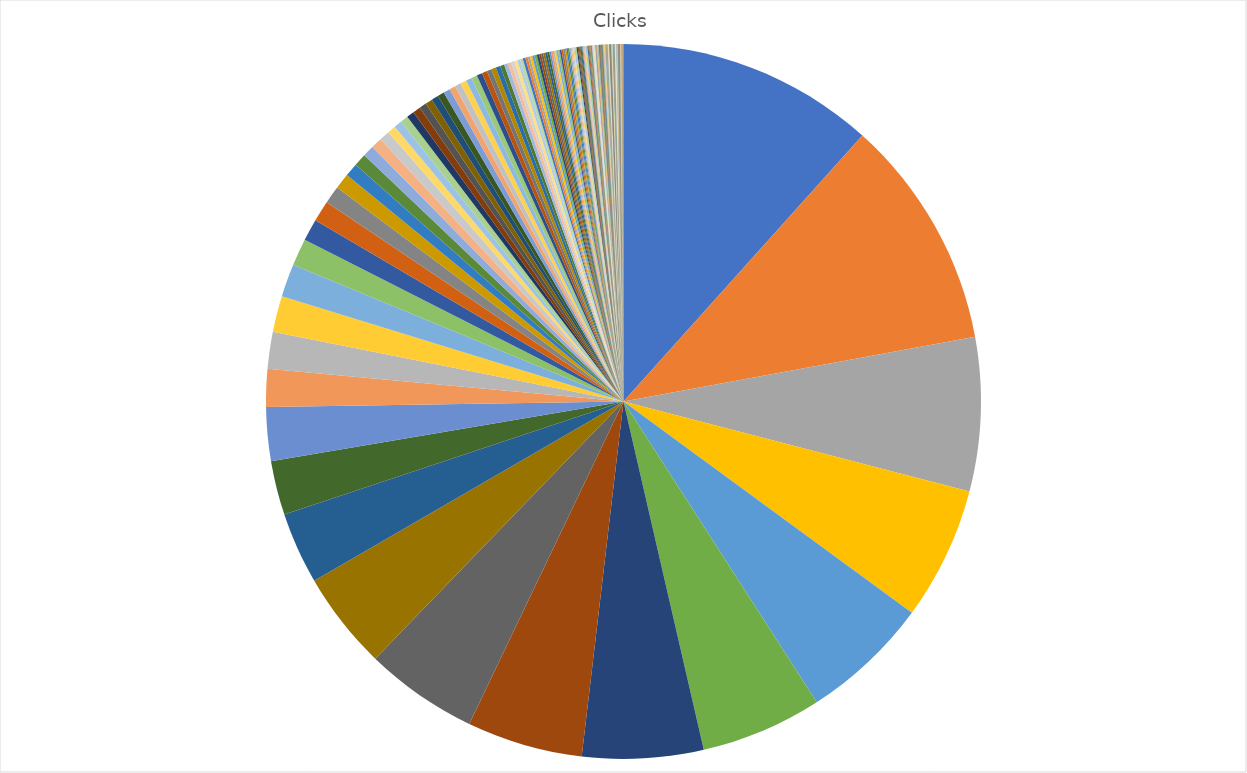
| Category | Clicks |
|---|---|
| https://www.creativescotland.com/funding/funding-programmes/hardship-fund-for-creative-freelancers | 883 |
| https://www.gov.scot/news/extending-support-for-hospitality-retail-and-leisure/ | 793 |
| https://www.gov.scot/news/accelerating-support-1/ | 527 |
| https://www.gov.scot/publications/coronavirus-covid-19-strategic-framework-business-fund/pages/overview/ | 456 |
| https://www.gov.uk/guidance/claim-a-grant-through-the-self-employment-income-support-scheme | 443 |
| https://www.digitalboostdevelopmentgrant.co.uk/ | 416 |
| https://www.visitscotland.org/events/funding/pivotal-event-businesses-fund | 415 |
| https://www.gov.uk/government/news/chancellor-extends-furlough-and-loan-schemes | 397 |
| https://www.gov.scot/publications/coronavirus-covid-19-stay-at-home-guidance/ | 388 |
| https://www.british-business-bank.co.uk/ourpartners/coronavirus-business-interruption-loan-scheme-cbils-2/ | 335 |
| https://www.gov.scot/publications/coronavirus-covid-19-manufacturing-sector-guidance/pages/where-we-are-now/ | 246 |
| https://www.gov.uk/guidance/claim-for-wages-through-the-coronavirus-job-retention-scheme | 186 |
| https://www.gov.scot/publications/coronavirus-covid-19-strategic-framework-business-fund/pages/eligibility/ | 184 |
| https://www.gov.scot/publications/coronavirus-covid-19-taxi-and-private-hire-driver-support-fund/ | 129 |
| https://www.parentclub.scot/articles/your-guide-childcare | 126 |
| https://r1.dotdigital-pages.com/p/4X7B-3CA/fbs-email-updates | 124 |
| https://www.gov.uk/guidance/apply-for-a-coronavirus-bounce-back-loan | 113 |
| https://www.gov.scot/news/strengthening-lockdown-restrictions/ | 93 |
| https://www.gov.scot/publications/coronavirus-covid-19-guidance-on-travel-and-transport/#travelbetween | 75 |
| http://www.renfrewshire.gov.uk/coronavirus-businesses#Renfrewshire-Business-Support-Fund | 72 |
| https://www.gov.scot/publications/coronavirus-covid-19-public-health-checks-at-borders/pages/exemptions/ | 61 |
| https://www.gov.uk/government/organisations/insolvency-service | 53 |
| https://www.cs-ic.org/constructionscotland/resources/ | 46 |
| https://www.gov.uk/government/news/business-evictions-ban-extended-until-march | 43 |
| https://www.gov.uk/government/publications/job-retention-bonus/job-retention-bonus | 39 |
| https://www.glasgow.gov.uk/article/25866/Information-for-Service-Users | 38 |
| https://www.gov.scot/publications/coronavirus-covid-19-small-and-micro-businesses-guidance/ | 36 |
| https://www.creativescotland.com/__data/assets/pdf_file/0011/85295/Hardship_Fund_For_Creative_Freelancers_Guidance.pdf | 28 |
| https://www.highland.gov.uk/info/20016/coronavirus/945/strategic_framework_business_fund | 27 |
| https://www.gov.scot/news/supporting-the-legal-profession/ | 27 |
| https://www.gov.scot/publications/coronavirus-covid-19-retail-sector-guidance/pages/close-contact-services/ | 26 |
| https://www.creativescotland.com/funding/funding-programmes/targeted-funding/touring-fund | 26 |
| https://www.gov.scot/publications/coronavirus-covid-19-protection-levels/ | 25 |
| https://www.edinburgh.gov.uk/coronavirus-4/businesses-employers/4?documentId=12924&categoryId=20297 | 24 |
| https://scvo.scot/support/coronavirus/funding/scottish-government/community-recovery | 24 |
| https://www.gov.scot/publications/coronavirus-covid-19-tourism-and-hospitality-sector-guidance/ | 23 |
| https://www.gov.scot/publications/coronavirus-covid-19-public-health-checks-at-borders/pages/overview/ | 23 |
| https://www.gov.uk/guidance/coronavirus-covid-19-what-to-do-if-youre-self-employed-and-getting-less-work-or-no-work | 21 |
| https://www.foodstandards.gov.scot/publications-and-research/publications/covid-19-guidance-for-food-business-operators-and-their-employees | 21 |
| https://www.bgateway.com/resources/running-a-business | 21 |
| https://www.businessgatewayfife.com/level3-business-support | 20 |
| https://www.northlanarkshire.gov.uk/coronavirus/support-businesses/strategic-framework-business-grant | 20 |
| https://findbusinesssupport.gov.scot/media/1099/covid-19-business-continuity-checklist-110620.docx | 19 |
| https://www.gov.uk/guidance/pay-coronavirus-job-retention-scheme-grants-back | 18 |
| https://www.gov.scot/publications/coronavirus-covid-19-returning-to-work/ | 16 |
| https://www.gov.scot/news/travel-corridors-suspended/ | 16 |
| https://www.gov.scot/publications/coronavirus-covid-19-retail-sector-guidance/ | 16 |
| https://www.gov.uk/guidance/haulier-advice-site-locations | 14 |
| https://www.southlanarkshire.gov.uk/SFbusinessfund | 13 |
| https://www.gov.uk/employment-support-allowance | 12 |
| https://www.gov.scot/publications/coronavirus-covid-19-tourism-and-hospitality-sector-guidance/pages/hospitality-statutory-guidance/ | 11 |
| https://www.gov.scot/publications/coronavirus-covid-19-general-guidance-for-safer-workplaces/ | 11 |
| https://www.ruralpayments.org/news-events/covid-19-guidance-for-farmers-and-crofters.html | 10 |
| https://www.pkc.gov.uk/sfbusinessfund | 9 |
| https://www.ourskillsforce.co.uk/help-with-recruitment/covid-employer-vacancy-landing-page/ | 9 |
| https://www.gov.scot/publications/coronavirus-covid-19-guidance-moving-home/ | 8 |
| https://www.bls.scot/apply-now | 8 |
| https://www.gov.scot/publications/coronavirus-covid-19-test-and-protect/pages/advice-for-employers/ | 8 |
| https://michelindevelopment.co.uk/ | 8 |
| https://www.westlothian.gov.uk/business-support-fund | 8 |
| https://www.gov.scot/publications/coronavirus-covid-19-manufacturing-sector-guidance/ | 8 |
| https://www.gov.uk/guidance/claim-a-grant-through-the-coronavirus-covid-19-self-employment-income-support-scheme | 7 |
| https://www.gov.scot/publications/test-protect-multi-sector-guidance-collection-customer-visitor-contact-details-july-2020/pages/1/ | 7 |
| https://www.scotborders.gov.uk/info/20014/social_care_and_health/1018/coronavirus_covid-19_business_information | 7 |
| https://www.aberdeencity.gov.uk/services/coronavirus-covid-19/covid-19-strategic-framework-business-fund | 7 |
| https://www.dundeecity.gov.uk/coronavirus/covid-19-advice-for-business | 7 |
| https://www.gov.scot/publications/coronavirus-covid-19-public-and-customer-toilets-guidance/ | 6 |
| https://www.transport.gov.scot/coronavirus-covid-19/transport-transition-plan/guidance-for-transport-operators/ | 6 |
| https://www.eastdunbarton.gov.uk/user#overlay=webform/strategic-framework-business-fund-application | 6 |
| https://www.gov.scot/publications/coronavirus-covid-19-guidance-on-sport-and-leisure-facilities/ | 6 |
| https://www.gov.scot/publications/coronavirus-covid-19-landlord-and-letting-agent-faqs/ | 6 |
| https://www.aberdeenshire.gov.uk/business/business-covid-19/covid-19-strategic-framework-business-fund/ | 6 |
| https://www.gov.scot/publications/coronavirus-covid-19-business-contingency-fund/ | 6 |
| https://www.gov.scot/publications/coronavirus-covid-19-guidance-for-call-centres-and-customer-contact-centre-environments/ | 6 |
| https://www.gov.scot/publications/coronavirus-covid-19-test-and-protect-advice-for-employers/ | 6 |
| https://www.west-dunbarton.gov.uk/business/grant-and-loan/strategic-framework-business-fund/ | 5 |
| https://supportdg.dumgal.gov.uk/article/21623/Coronavirus-COVID-19-Strategic-Framework-Business-Fund | 5 |
| https://www.gov.uk/guidance/claim-for-wage-costs-through-the-coronavirus-job-retention-scheme | 5 |
| https://www.falkirk.gov.uk/covid19/sfbhf.aspx | 5 |
| https://www.gov.scot/publications/covid-shielding/pages/returning-to-work/ | 4 |
| https://beta.south-ayrshire.gov.uk/article/25209/Coronavirus-Strategic-framework-business-fund | 4 |
| https://www.gov.scot/publications/coronavirus-covid-19-events-sector-guidance/ | 4 |
| https://www.gov.scot/publications/coronavirus-covid-19-vehicle-lessons/ | 4 |
| https://www.gov.scot/publications/coronavirus-covid-19-construction-sector-guidance/ | 4 |
| https://www.gov.scot/publications/coronavirus-covid-19-guidance-for-small-marriages-and-civil-partnership-registrations/ | 4 |
| https://www.gov.scot/publications/coronavirus-covid-19-creative-studios-and-shared-workspaces/ | 3 |
| https://www.gov.scot/publications/coronavirus-covid-19-guidance-for-consumers/ | 3 |
| https://www.angus.gov.uk/business/covid_19_support_for_business | 3 |
| https://www.gov.uk/government/news/tax-helpline-to-support-businesses-affected-by-coronavirus-covid-19 | 3 |
| https://www.gov.scot/publications/coronavirus-covid-19-support-to-childcare-sector/ | 3 |
| https://www.gov.scot/publications/coronavirus-covid-19-restrictions-fund/ | 3 |
| http://www.moray.gov.uk/moray_standard/page_133282.html | 3 |
| https://www.eastlothian.gov.uk/supportgrants | 3 |
| https://www.gov.scot/publications/coronavirus-covid-19-advice-for-animal-owners/ | 3 |
| https://www.gov.uk/government/news/coronavirus-support-for-employees-benefit-claimants-and-businesses | 3 |
| https://business.bankofscotland.co.uk/business-home/coronavirus.html | 3 |
| https://www.gov.uk/universal-credit | 3 |
| https://foodanddrink.scot/coronavirus-information-hub/ | 3 |
| https://www.gov.scot/publications/coronavirus-covid-19-financial-services-sector-guidance/ | 3 |
| https://www.gov.scot/publications/coronavirus-covid-19-social-care-staff-support-fund-guidance/ | 2 |
| https://www.gov.scot/publications/coronavirus-covid-19-childminder-services-guidance/ | 2 |
| https://forestry.gov.scot/covid-19 | 2 |
| https://www.scottish-enterprise.com/learning-zone/business-guides/components-folder/business-guides-listing/finance-options-for-your-business | 2 |
| https://www.scottish-enterprise.com/support-for-businesses/develop-products-and-services/support-for-manufacturers | 2 |
| https://www.midlothian.gov.uk/coronavirus-business | 2 |
| https://www.gov.uk/employers-sick-pay | 2 |
| https://www.mygov.scot/non-domestic-rates-coronavirus/ | 2 |
| https://www.gov.scot/news/gbp-104-million-tourism-and-hospitality-lifeline/ | 2 |
| https://www.gov.scot/news/supporting-the-seafood-sector/ | 2 |
| https://www.sasa.gov.uk/covid-19-guidance | 2 |
| https://www.north-ayrshire.gov.uk/coronavirus/Business-licensing-Coronavirus-COVID-19-updates.aspx | 2 |
| https://www.highland.gov.uk/coronavirus/businessgrant | 2 |
| https://newsroom.moray.gov.uk/news/moray-business-resilience-forum-established-to-support-businesses-through-covid-19-outbreak | 2 |
| http://www.renfrewshire.gov.uk/coronavirus-businesses#strategic-framework-fund | 2 |
| https://www.acas.org.uk/checking-sick-pay/statutory-sick-pay-ssp | 2 |
| https://www.gov.scot/publications/coronavirus-covid-19-guidance-for-museums-galleries-and-heritage-attractions/ | 2 |
| https://www.clacks.gov.uk/coronavirus/sfbusinessfundcv/ | 2 |
| https://www.gov.uk/difficulties-paying-hmrc | 2 |
| !Products=/coronavirus/funding/hospitality/keywords=coronavirus%20support%20from%20business%20representative%20organisations%20and%20trade%20associations/most-relevant/show+25/page+1 | 2 |
| https://www.mygov.scot/non-domestic-rates-relief/small-business-bonus-scheme/ | 2 |
| https://www.east-ayrshire.gov.uk/CouncilAndGovernment/Coronavirus/Business-support.aspx | 2 |
| https://www.gov.scot/publications/aquaculture-storage-aid/ | 2 |
| https://www.gov.scot/publications/coronavirus-covid-19-safer-public-spaces-scotland-urban-centres-green-spaces/ | 2 |
| https://www.british-business-bank.co.uk/ourpartners/coronavirus-business-interruption-loan-schemes/clbils/clbils-for-businesses-and-advisors/ | 2 |
| https://www.edinburgh.gov.uk/coronavirus-4/businesses-employers | 2 |
| https://www.gov.uk/government/publications/revenue-and-customs-brief-7-2020-domestic-reverse-charge-vat-for-construction-services-delay-in-implementation | 1 |
| !Products=/coronavirus/leisure/keywords=coronavirus%20support%20from%20business%20representative%20organisations%20and%20trade%20associations/most-relevant/show+25/page+1 | 1 |
| https://www.midlothian.gov.uk/news/article/2923/latest_update_for_businesses_friday_20_march | 1 |
| https://www.startuploans.co.uk/ | 1 |
| https://www.gov.scot/publications/coronavirus-covid-19-stadium-sector-guidance-for-professional-football-and-rugby/ | 1 |
| https://www.creativescotland.com/funding/funding-programmes/open-fund-sustaining-creative-development | 1 |
| https://www.tnlcommunityfund.org.uk/ | 1 |
| https://www.british-business-bank.co.uk/ourpartners/coronavirus-business-interruption-loan-scheme-cbils/ | 1 |
| https://www.gov.uk/government/news/covid-19-update-on-tax-policy-documents | 1 |
| https://findbusinesssupport.gov.scot/media/1085/tourism-helplist-27-march-2020.docx | 1 |
| https://www.argyll-bute.gov.uk/strategic-framework-business-fund | 1 |
| https://www.gov.scot/publications/coronavirus-covid-19-guidance-for-the-performing-arts-and-venues-sector/ | 1 |
| https://www.skillsdevelopmentscotland.co.uk/what-we-do/employability-skills/partnership-action-for-continuing-employment-pace/ | 1 |
| https://www.rwcu.co.uk/ | 1 |
| https://www.scottish-enterprise.com/learning-zone/business-guides/components-folder/business-guides-listing/a-guide-to-debt | 1 |
| https://www.gov.uk/guidance/future-fund | 1 |
| https://www.lifesciencesscotland.com/covid-19 | 1 |
| https://www.gov.uk/government/topical-events/coronavirus-covid-19-uk-government-response | 1 |
| https://www.bgateway.com/resources/finance | 1 |
| https://www.british-business-bank.co.uk/ourpartners/coronavirus-business-interruption-loan-schemes/clbils/ | 1 |
| https://my.shetland.gov.uk/en/AchieveForms/?mode=fill&consentMessage=y&form_uri=sandbox-publish://AF-Process-36858487-0277-4ff4-a28f-b3d194ef50b6/AF-Stage-4c15dc8b-6b0b-47ce-8a3e-21dd420e1307/definition.json&redirectlink=%2Fen&cancelRedirectLink=%2Fen&cons | 1 |
| https://www.stirling.gov.uk/jobs-business-investment/coronavirus-covid-19-strategic-framework-business-fund/ | 1 |
| https://www.uk-futurefund.co.uk/s/ | 1 |
| https://www.aim.org.uk/#/news/aim-launches-1m-immediate-access-crisis-fund-for-independent-music-contractors | 1 |
| https://www.gov.scot/publications/coronavirus-covid-19-guidance-for-homeworking/ | 1 |
| https://www.santandercb.co.uk/financing/corporate-lending/specialised-finance/enterprise-finance-guarantee-scheme | 1 |
| https://www.gov.scot/publications/coronavirus-covid-19-businesses-and-workplaces-that-must-close-and-can-open-at-each-protection-level/ | 1 |
| https://www.prepareforbrexit.scot/ | 1 |
| https://www.gov.scot/publications/coronavirus-covid-19-statement-to-telecommunications-operators-on-build-and-maintenance-of-networks/ | 1 |
| https://www.gov.scot/publications/coronavirus-covid-19-guidance-for-laboratories-and-research-facilities/ | 1 |
| https://www.gov.scot/publications/coronavirus-covid-19-manufacturing-sector-guidance/pages/overview/ | 1 |
| https://protect.scot/ | 1 |
| https://www.bgateway.com/resources/how-to-start-a-business-in-challenging-times | 1 |
| https://www.gov.scot/publications/coronavirus-covid-19-public-libraries-guidance/ | 1 |
| https://www.visitscotland.org/supporting-your-business/advice/coronavirus | 1 |
| https://www.inverclyde.gov.uk/council-and-government/non-domestic-rates/coronavirus-business-support-fund | 1 |
| https://www.glasgow.gov.uk/coronavirusbusinessfund | 1 |
| https://www.publiccontractsscotland.gov.uk/ | 1 |
| https://www.gov.uk/government/consultations/draft-legislation-taxation-of-coronavirus-covid-19-support-payments | 1 |
| https://www.eastdunbarton.gov.uk/residents/business/business-support-during-coronavirus-emergency | 1 |
| https://www.bgateway.com/resources/digitalboost | 1 |
| https://www.gov.uk/getting-an-mot | 1 |
| https://www.gov.scot/publications/coronavirus-covid-19-caravan-sites-and-holiday-parks/ | 1 |
| https://www.supplierjourney.scot/ | 1 |
| https://www.fife.gov.uk/kb/docs/articles/health-and-social-care2/coronavirus-covid-19/businesses-and-employers | 1 |
| https://www.gov.scot/publications/coronavirus-covid-19-taxi-and-private-hire-driver-support-fund/pages/overview/ | 1 |
| https://www.hse.gov.uk/coronavirus/working-safely/index.htm | 1 |
| https://www.gov.scot/publications/coronavirus-covid-19-european-structural-and-investment-funds/ | 1 |
| https://www.youthlinkscotland.org/news/november-2020/covid-19-residential-outdoor-education-centre-recovery-fund/ | 1 |
| https://orkney-self.achieveservice.com/en/AchieveForms/?form_uri=sandbox-publish://AF-Process-ef41ce9c-3730-4d29-8997-641086447f36/AF-Stage-fed236b7-9701-4ff1-bbdf-01a0df1ee187/definition.json&redirectlink=%2Fen&cancelRedirectLink=%2Fen&consentMessage=yes | 1 |
| https://rankfoundation.com/covid19-recovery-fund/ | 1 |
| https://www.gov.scot/news/support-for-seafood-fishing-industry/ | 1 |
| https://makeitclick.learnmyway.com/directory | 1 |
| https://www.pkc.gov.uk/coronavirus/business | 1 |
| https://www.supplierjourney.scot/privacy-policy-and-content-disclaimer | 1 |
| https://www.gov.scot/publications/coronavirus-covid-19-protection-levels/pages/protection-level-4/ | 1 |
| https://www.aberdeencity.gov.uk/services/coronavirus-covid-19/businesses | 1 |
| https://www.scdi.org.uk/events/ | 1 |
| https://www.gov.scot/publications/coronavirus-covid-19-waste-sector-guidance/ | 1 |
| https://secure.cbonline.co.uk/business/our-products/loans-and-finance/borrowing-facilities/business-loans/coronavirus-business-interruption-loan-scheme/ | 1 |
| https://www.scottishmediation.org.uk/covid-19-mediation-service/ | 1 |